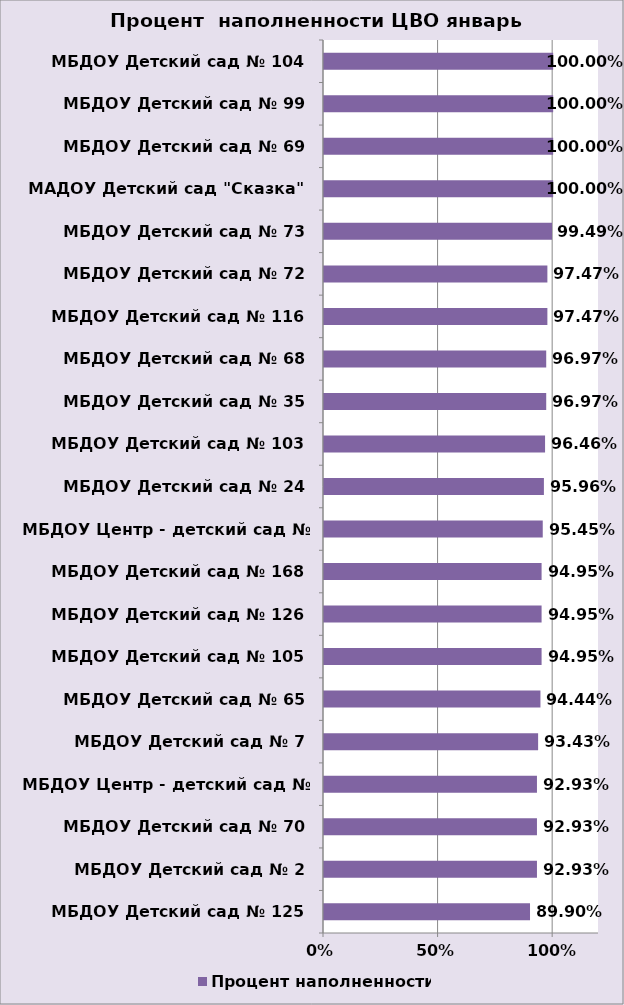
| Category | Процент наполненности |
|---|---|
| МБДОУ Детский сад № 125 | 0.899 |
| МБДОУ Детский сад № 2 | 0.929 |
| МБДОУ Детский сад № 70 | 0.929 |
| МБДОУ Центр - детский сад № 40 | 0.929 |
| МБДОУ Детский сад № 7 | 0.934 |
| МБДОУ Детский сад № 65 | 0.944 |
| МБДОУ Детский сад № 105 | 0.949 |
| МБДОУ Детский сад № 126 | 0.949 |
| МБДОУ Детский сад № 168 | 0.949 |
| МБДОУ Центр - детский сад № 133 | 0.955 |
| МБДОУ Детский сад № 24 | 0.96 |
| МБДОУ Детский сад № 103 | 0.965 |
| МБДОУ Детский сад № 35 | 0.97 |
| МБДОУ Детский сад № 68 | 0.97 |
| МБДОУ Детский сад № 116 | 0.975 |
| МБДОУ Детский сад № 72 | 0.975 |
| МБДОУ Детский сад № 73 | 0.995 |
| МАДОУ Детский сад "Сказка" | 1 |
| МБДОУ Детский сад № 69 | 1 |
| МБДОУ Детский сад № 99 | 1 |
| МБДОУ Детский сад № 104 | 1 |